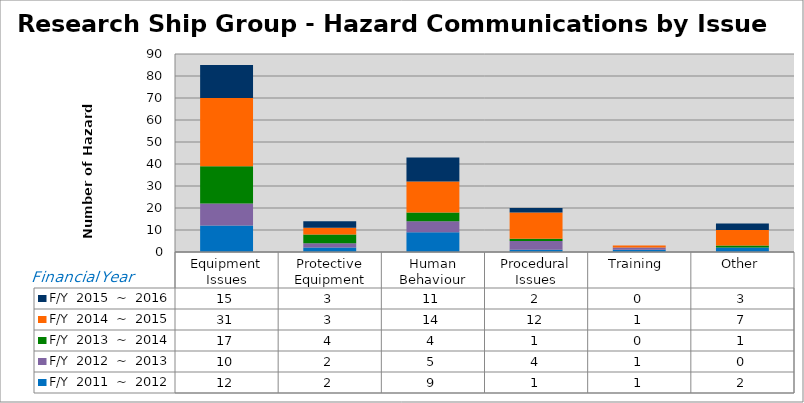
| Category | F/Y  2011  ~  2012 | F/Y  2012  ~  2013 | F/Y  2013  ~  2014 | F/Y  2014  ~  2015 | F/Y  2015  ~  2016 |
|---|---|---|---|---|---|
| Equipment Issues | 12 | 10 | 17 | 31 | 15 |
| Protective Equipment | 2 | 2 | 4 | 3 | 3 |
| Human Behaviour | 9 | 5 | 4 | 14 | 11 |
| Procedural Issues | 1 | 4 | 1 | 12 | 2 |
| Training  | 1 | 1 | 0 | 1 | 0 |
| Other | 2 | 0 | 1 | 7 | 3 |